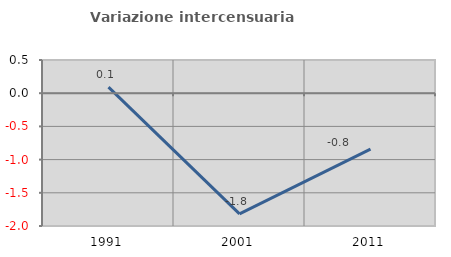
| Category | Variazione intercensuaria annua |
|---|---|
| 1991.0 | 0.091 |
| 2001.0 | -1.818 |
| 2011.0 | -0.843 |